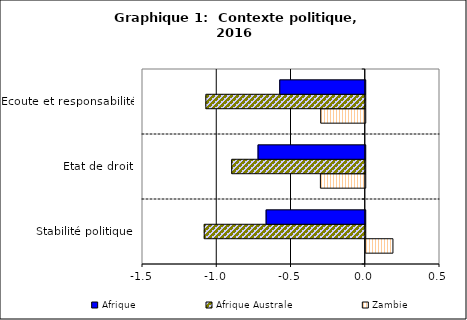
| Category | Zambie | Afrique Australe | Afrique |
|---|---|---|---|
| Stabilité politique | 0.183 | -1.084 | -0.667 |
| Etat de droit | -0.302 | -0.899 | -0.722 |
| Ecoute et responsabilité | -0.3 | -1.073 | -0.576 |